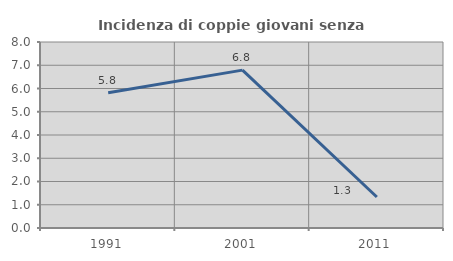
| Category | Incidenza di coppie giovani senza figli |
|---|---|
| 1991.0 | 5.814 |
| 2001.0 | 6.79 |
| 2011.0 | 1.333 |